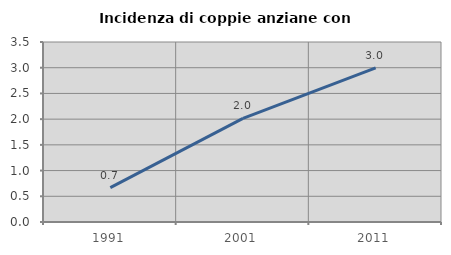
| Category | Incidenza di coppie anziane con figli |
|---|---|
| 1991.0 | 0.668 |
| 2001.0 | 2.015 |
| 2011.0 | 2.995 |